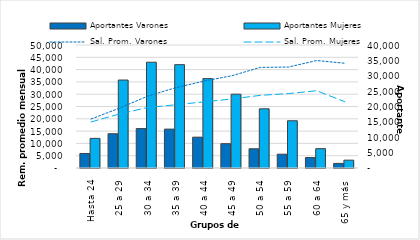
| Category | Aportantes Varones | Aportantes Mujeres |
|---|---|---|
| 0 | 4722 | 9636 |
| 1 | 11140 | 28610 |
| 2 | 12816 | 34403 |
| 3 | 12644 | 33608 |
| 4 | 10027 | 29075 |
| 5 | 7901 | 24000 |
| 6 | 6254 | 19245 |
| 7 | 4485 | 15361 |
| 8 | 3398 | 6292 |
| 9 | 1491 | 2546 |